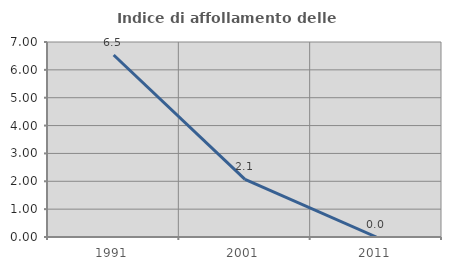
| Category | Indice di affollamento delle abitazioni  |
|---|---|
| 1991.0 | 6.534 |
| 2001.0 | 2.066 |
| 2011.0 | 0 |